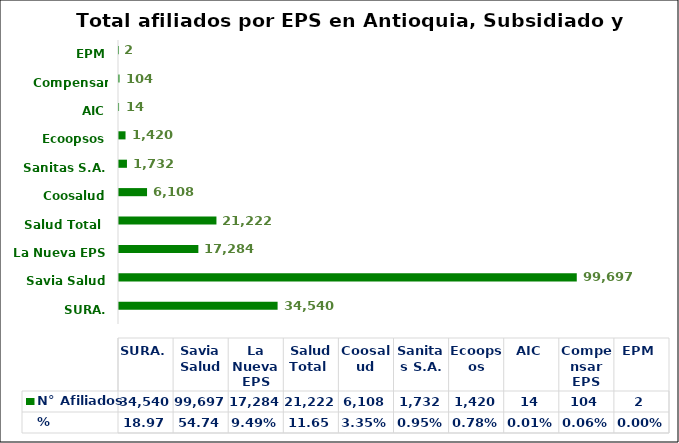
| Category | % | N° Afiliados |
|---|---|---|
| SURA. | 0.19 | 34540 |
| Savia Salud | 0.547 | 99697 |
| La Nueva EPS | 0.095 | 17284 |
| Salud Total  | 0.117 | 21222 |
| Coosalud | 0.034 | 6108 |
| Sanitas S.A. | 0.01 | 1732 |
| Ecoopsos | 0.008 | 1420 |
| AIC | 0 | 14 |
| Compensar EPS | 0.001 | 104 |
| EPM | 0 | 2 |